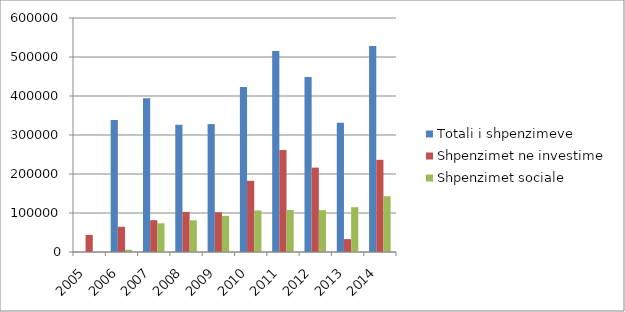
| Category | Totali i shpenzimeve | Shpenzimet ne investime | Shpenzimet sociale |
|---|---|---|---|
| 2005.0 | 0 | 43802 | 0 |
| 2006.0 | 338405 | 64794 | 5646 |
| 2007.0 | 394067 | 81580 | 73598 |
| 2008.0 | 326241 | 102704 | 81410 |
| 2009.0 | 328002 | 101943 | 92726 |
| 2010.0 | 423066 | 182609 | 106490 |
| 2011.0 | 515412 | 261448 | 107786 |
| 2012.0 | 448939 | 216365 | 107209 |
| 2013.0 | 331624 | 33042 | 114912 |
| 2014.0 | 527896 | 236400 | 143089 |